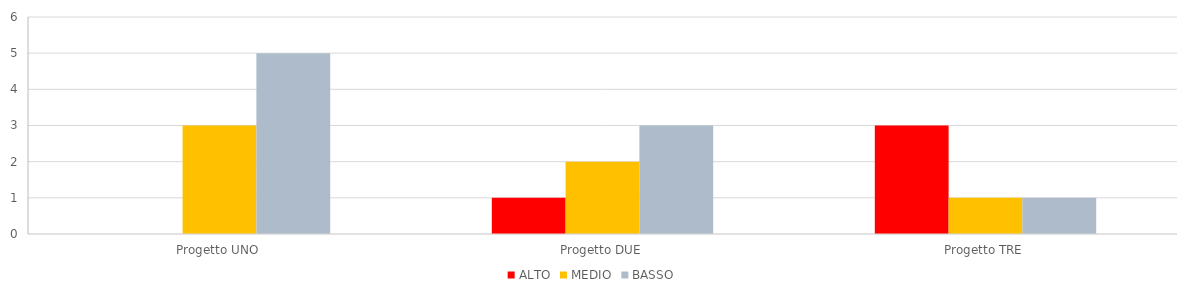
| Category | ALTO | MEDIO | BASSO |
|---|---|---|---|
| Progetto UNO | 0 | 3 | 5 |
| Progetto DUE | 1 | 2 | 3 |
| Progetto TRE | 3 | 1 | 1 |